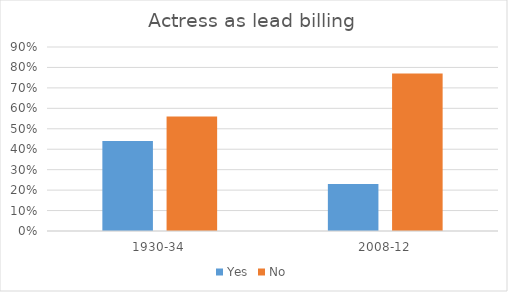
| Category | Yes | No |
|---|---|---|
| 1930-34 | 0.44 | 0.56 |
| 2008-12 | 0.23 | 0.77 |